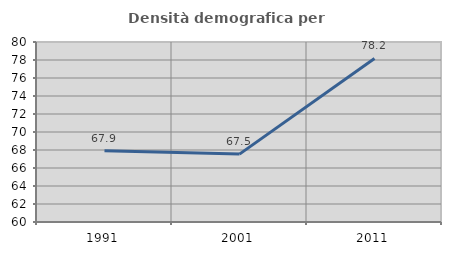
| Category | Densità demografica |
|---|---|
| 1991.0 | 67.928 |
| 2001.0 | 67.543 |
| 2011.0 | 78.171 |